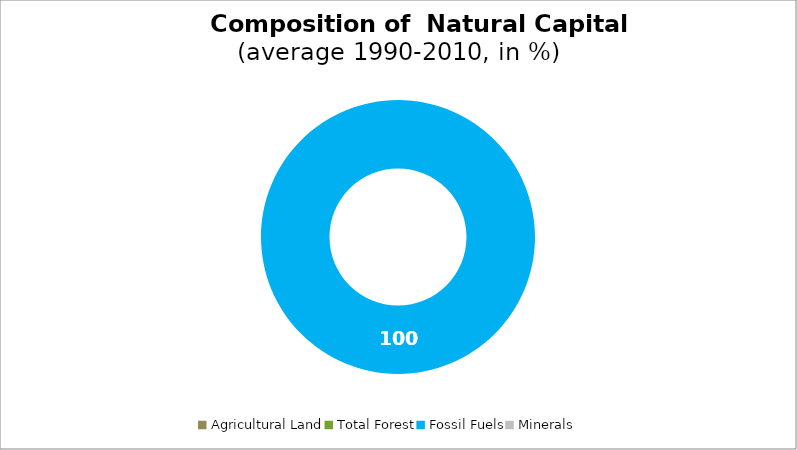
| Category | Series 0 |
|---|---|
| Agricultural Land | 0 |
| Total Forest | 0 |
| Fossil Fuels | 100 |
| Minerals | 0 |